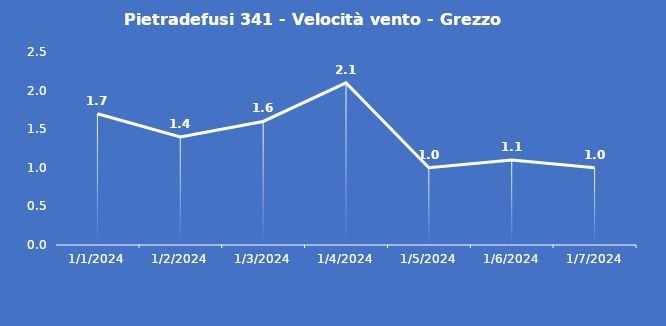
| Category | Pietradefusi 341 - Velocità vento - Grezzo (m/s) |
|---|---|
| 1/1/24 | 1.7 |
| 1/2/24 | 1.4 |
| 1/3/24 | 1.6 |
| 1/4/24 | 2.1 |
| 1/5/24 | 1 |
| 1/6/24 | 1.1 |
| 1/7/24 | 1 |